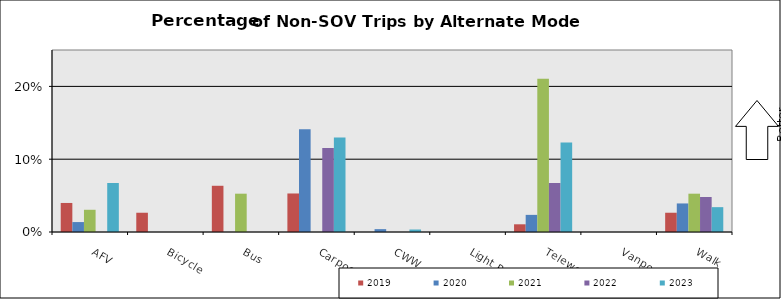
| Category | 2019 | 2020 | 2021 | 2022 | 2023 |
|---|---|---|---|---|---|
| AFV | 0.04 | 0.014 | 0.031 | 0 | 0.067 |
| Bicycle | 0.026 | 0 | 0 | 0 | 0 |
| Bus | 0.063 | 0 | 0.053 | 0 | 0 |
| Carpool | 0.053 | 0.141 | 0 | 0.115 | 0.13 |
| CWW | 0 | 0.004 | 0 | 0 | 0.003 |
| Light Rail | 0 | 0 | 0 | 0 | 0 |
| Telework | 0.011 | 0.024 | 0.211 | 0.067 | 0.123 |
| Vanpool | 0 | 0 | 0 | 0 | 0 |
| Walk | 0.026 | 0.039 | 0.053 | 0.048 | 0.034 |